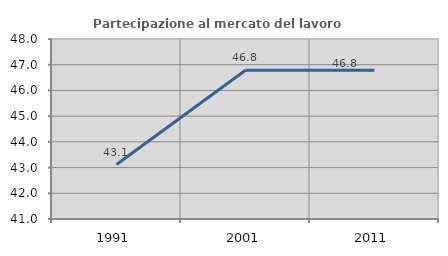
| Category | Partecipazione al mercato del lavoro  femminile |
|---|---|
| 1991.0 | 43.119 |
| 2001.0 | 46.782 |
| 2011.0 | 46.788 |